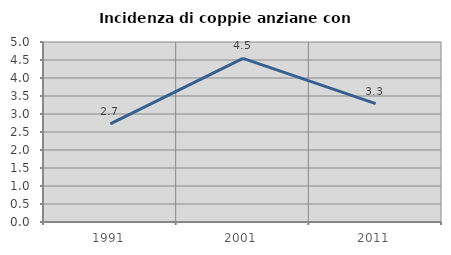
| Category | Incidenza di coppie anziane con figli |
|---|---|
| 1991.0 | 2.727 |
| 2001.0 | 4.545 |
| 2011.0 | 3.289 |